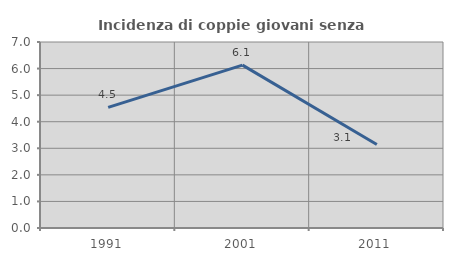
| Category | Incidenza di coppie giovani senza figli |
|---|---|
| 1991.0 | 4.538 |
| 2001.0 | 6.13 |
| 2011.0 | 3.142 |